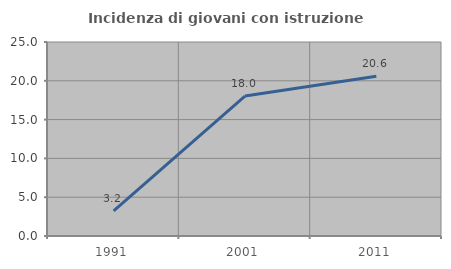
| Category | Incidenza di giovani con istruzione universitaria |
|---|---|
| 1991.0 | 3.226 |
| 2001.0 | 18.033 |
| 2011.0 | 20.588 |